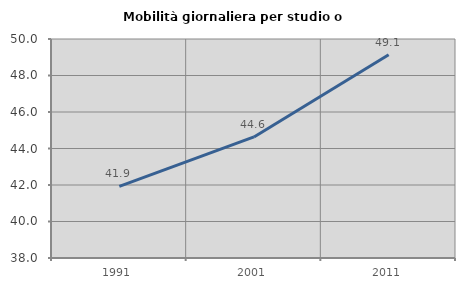
| Category | Mobilità giornaliera per studio o lavoro |
|---|---|
| 1991.0 | 41.926 |
| 2001.0 | 44.635 |
| 2011.0 | 49.137 |